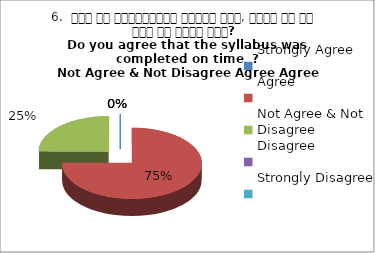
| Category | 6.  समय पर पाठ्यक्रम पूर्ण हुआ, क्या आप इस बात से सहमत हैं? 
Do you agree that the syllabus was completed on time  ?
 Not Agree & Not Disagree Agree Agree Agree |
|---|---|
| Strongly Agree | 0 |
| Agree | 3 |
| Not Agree & Not Disagree | 1 |
| Disagree | 0 |
| Strongly Disagree | 0 |